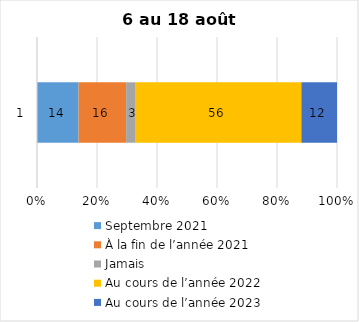
| Category | Septembre 2021 | À la fin de l’année 2021 | Jamais | Au cours de l’année 2022 | Au cours de l’année 2023 |
|---|---|---|---|---|---|
| 0 | 14 | 16 | 3 | 56 | 12 |